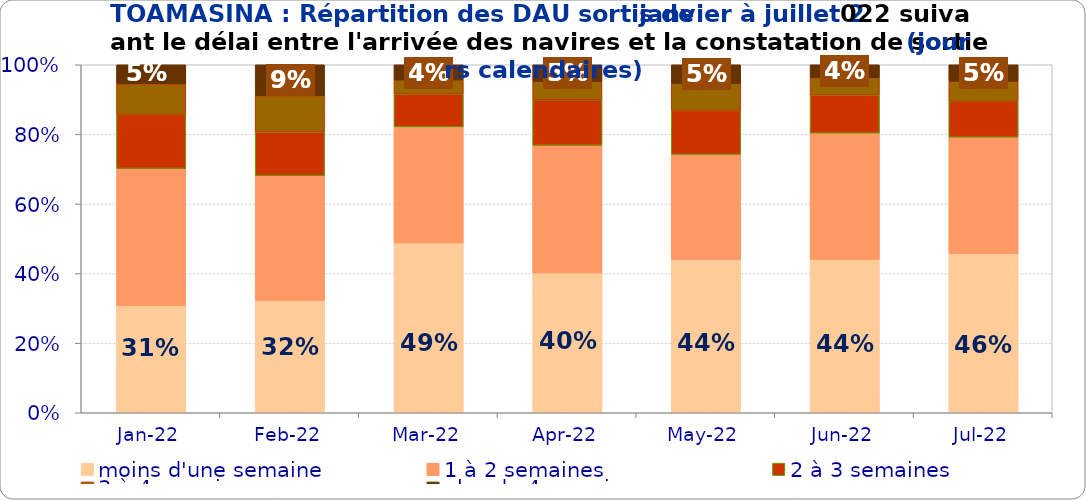
| Category | moins d'une semaine | 1 à 2 semaines | 2 à 3 semaines | 3 à 4 semaines | plus de 4 semaines |
|---|---|---|---|---|---|
| 2022-01-01 | 0.307 | 0.395 | 0.155 | 0.088 | 0.055 |
| 2022-02-01 | 0.323 | 0.358 | 0.126 | 0.104 | 0.089 |
| 2022-03-01 | 0.488 | 0.334 | 0.094 | 0.041 | 0.044 |
| 2022-04-01 | 0.402 | 0.367 | 0.131 | 0.053 | 0.048 |
| 2022-05-01 | 0.441 | 0.302 | 0.126 | 0.078 | 0.054 |
| 2022-06-01 | 0.441 | 0.363 | 0.109 | 0.05 | 0.037 |
| 2022-07-01 | 0.457 | 0.335 | 0.103 | 0.058 | 0.047 |